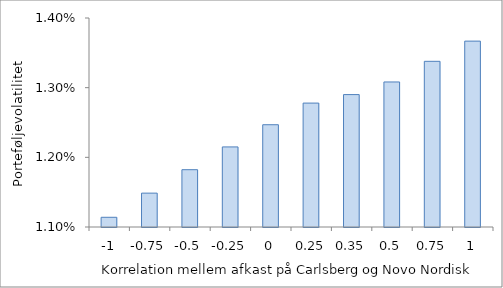
| Category | Series 0 |
|---|---|
| -1.0 | 0.011 |
| -0.75 | 0.011 |
| -0.5 | 0.012 |
| -0.25 | 0.012 |
| 0.0 | 0.012 |
| 0.25 | 0.013 |
| 0.35 | 0.013 |
| 0.5 | 0.013 |
| 0.75 | 0.013 |
| 1.0 | 0.014 |